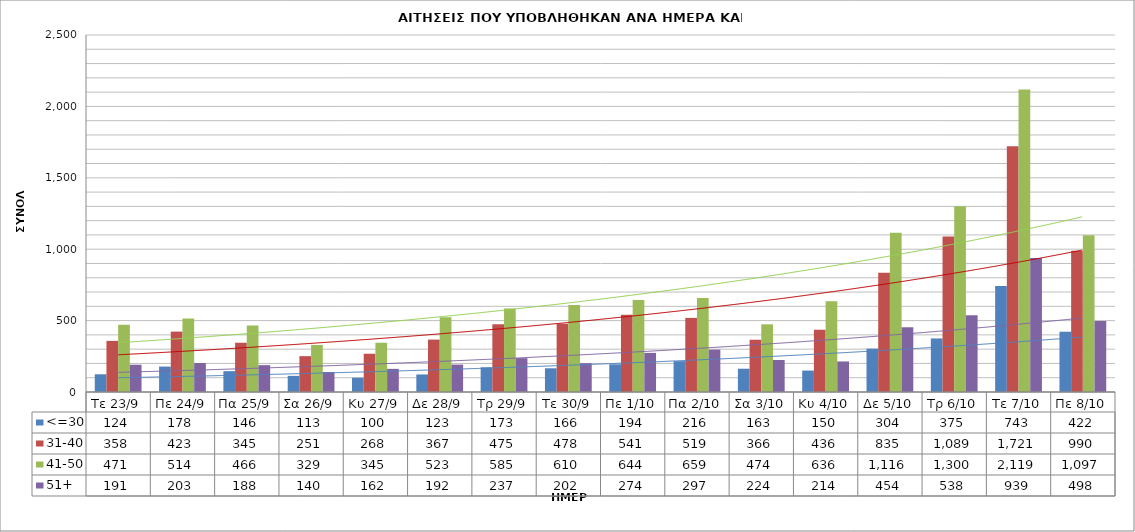
| Category | <=30 | 31-40 | 41-50 | 51+ |
|---|---|---|---|---|
| Τε 23/9 | 124 | 358 | 471 | 191 |
| Πε 24/9 | 178 | 423 | 514 | 203 |
| Πα 25/9 | 146 | 345 | 466 | 188 |
| Σα 26/9 | 113 | 251 | 329 | 140 |
| Κυ 27/9 | 100 | 268 | 345 | 162 |
| Δε 28/9 | 123 | 367 | 523 | 192 |
| Τρ 29/9 | 173 | 475 | 585 | 237 |
| Τε 30/9 | 166 | 478 | 610 | 202 |
| Πε 1/10 | 194 | 541 | 644 | 274 |
| Πα 2/10 | 216 | 519 | 659 | 297 |
| Σα 3/10 | 163 | 366 | 474 | 224 |
| Κυ 4/10 | 150 | 436 | 636 | 214 |
| Δε 5/10 | 304 | 835 | 1116 | 454 |
| Τρ 6/10 | 375 | 1089 | 1300 | 538 |
| Τε 7/10 | 743 | 1721 | 2119 | 939 |
| Πε 8/10 | 422 | 990 | 1097 | 498 |